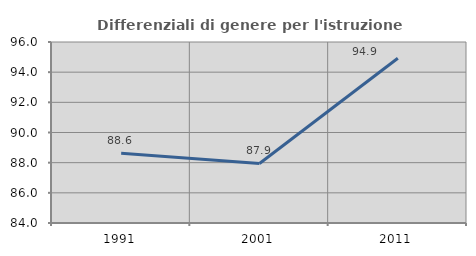
| Category | Differenziali di genere per l'istruzione superiore |
|---|---|
| 1991.0 | 88.628 |
| 2001.0 | 87.949 |
| 2011.0 | 94.921 |